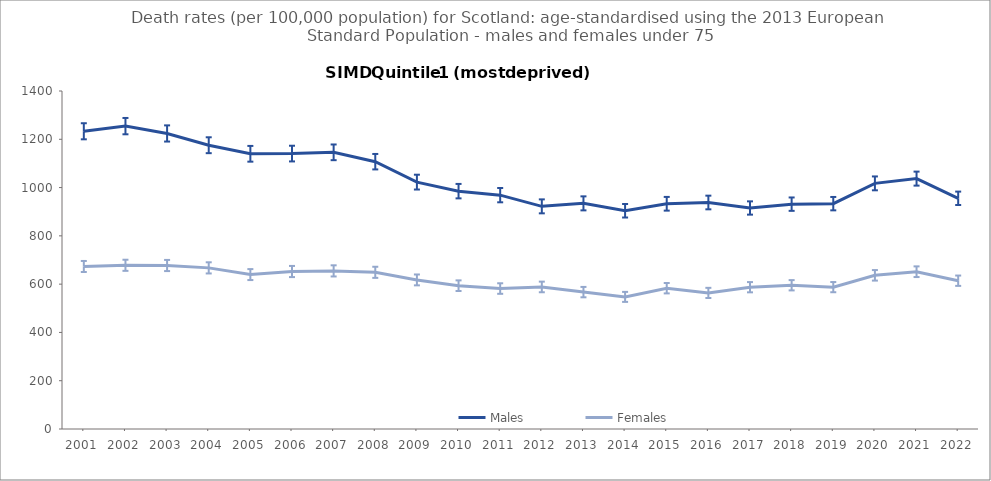
| Category | Males | Females |
|---|---|---|
| 2001.0 | 1233.2 | 673.2 |
| 2002.0 | 1254.5 | 678.1 |
| 2003.0 | 1224.1 | 677.2 |
| 2004.0 | 1175.4 | 667.4 |
| 2005.0 | 1139.9 | 639.6 |
| 2006.0 | 1140.8 | 652.3 |
| 2007.0 | 1146 | 654.9 |
| 2008.0 | 1107.2 | 649 |
| 2009.0 | 1022.6 | 617.5 |
| 2010.0 | 985.2 | 593.6 |
| 2011.0 | 968.6 | 581.8 |
| 2012.0 | 922.2 | 588.4 |
| 2013.0 | 934.6 | 567 |
| 2014.0 | 904 | 547.2 |
| 2015.0 | 932.9 | 583.2 |
| 2016.0 | 938.2 | 563.7 |
| 2017.0 | 915.4 | 587.3 |
| 2018.0 | 931.3 | 595.4 |
| 2019.0 | 933.4 | 587.6 |
| 2020.0 | 1017.4 | 636.5 |
| 2021.0 | 1037.1 | 651.5 |
| 2022.0 | 955.5 | 614.2 |